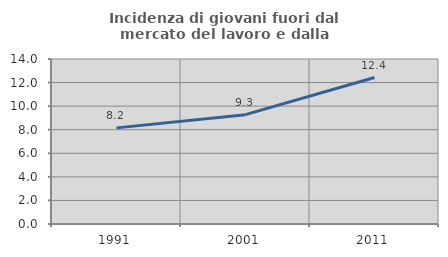
| Category | Incidenza di giovani fuori dal mercato del lavoro e dalla formazione  |
|---|---|
| 1991.0 | 8.156 |
| 2001.0 | 9.278 |
| 2011.0 | 12.429 |